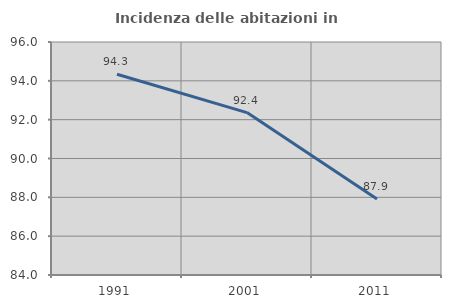
| Category | Incidenza delle abitazioni in proprietà  |
|---|---|
| 1991.0 | 94.34 |
| 2001.0 | 92.365 |
| 2011.0 | 87.919 |